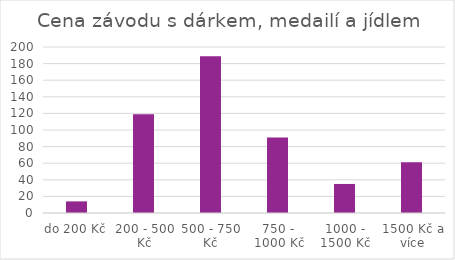
| Category | Series 0 |
|---|---|
| do 200 Kč | 14 |
| 200 - 500 Kč | 119 |
| 500 - 750 Kč | 189 |
| 750 - 1000 Kč | 91 |
| 1000 - 1500 Kč | 35 |
| 1500 Kč a více | 61 |